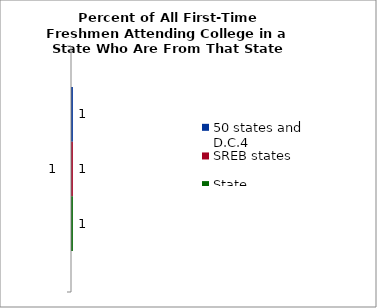
| Category | 50 states and D.C.4 | SREB states | State |
|---|---|---|---|
| 0 | 1 | 1 | 1 |